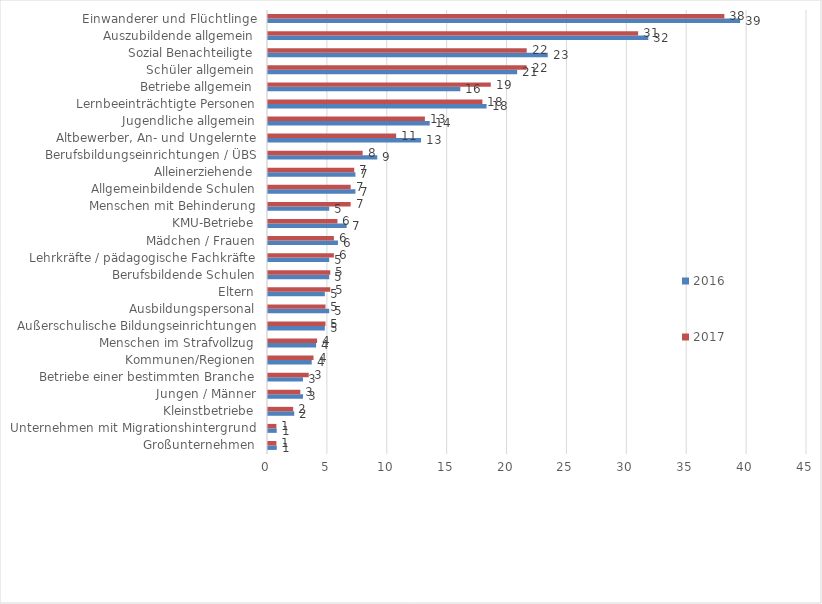
| Category | 2016 | 2017 |
|---|---|---|
| Großunternehmen | 0.73 | 0.7 |
| Unternehmen mit Migrationshintergrund | 0.73 | 0.7 |
| Kleinstbetriebe | 2.19 | 2.1 |
| Jungen / Männer | 2.92 | 2.7 |
| Betriebe einer bestimmten Branche | 2.92 | 3.4 |
| Kommunen/Regionen | 3.65 | 3.8 |
| Menschen im Strafvollzug | 4.015 | 4.1 |
| Außerschulische Bildungseinrichtungen | 4.745 | 4.8 |
| Ausbildungspersonal | 5.109 | 4.8 |
| Eltern | 4.745 | 5.2 |
| Berufsbildende Schulen | 5.109 | 5.2 |
| Lehrkräfte / pädagogische Fachkräfte | 5.109 | 5.5 |
| Mädchen / Frauen | 5.839 | 5.5 |
| KMU-Betriebe | 6.569 | 5.8 |
| Menschen mit Behinderung | 5.109 | 6.9 |
| Allgemeinbildende Schulen | 7.299 | 6.9 |
| Alleinerziehende | 7.299 | 7.2 |
| Berufsbildungseinrichtungen / ÜBS | 9.124 | 7.9 |
| Altbewerber, An- und Ungelernte | 12.774 | 10.7 |
| Jugendliche allgemein | 13.504 | 13.1 |
| Lernbeeinträchtigte Personen | 18.248 | 17.9 |
| Betriebe allgemein | 16.058 | 18.6 |
| Schüler allgemein | 20.803 | 21.6 |
| Sozial Benachteiligte | 23.358 | 21.6 |
| Auszubildende allgemein | 31.752 | 30.9 |
| Einwanderer und Flüchtlinge | 39.416 | 38.1 |